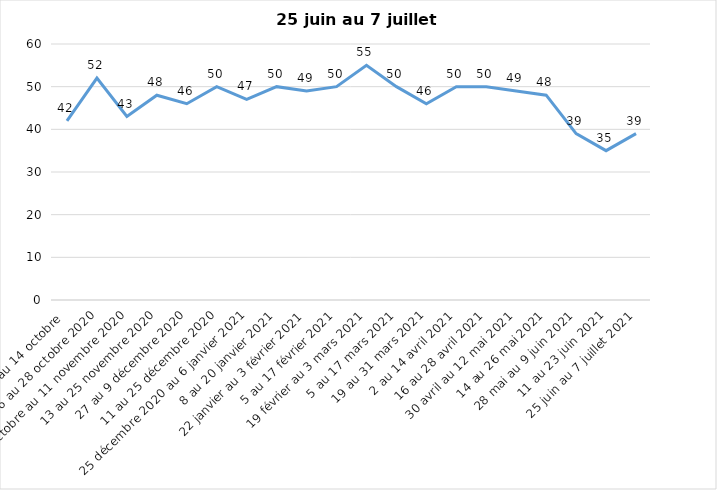
| Category | Toujours aux trois mesures |
|---|---|
| 2 au 14 octobre  | 42 |
| 16 au 28 octobre 2020 | 52 |
| 30 octobre au 11 novembre 2020 | 43 |
| 13 au 25 novembre 2020 | 48 |
| 27 au 9 décembre 2020 | 46 |
| 11 au 25 décembre 2020 | 50 |
| 25 décembre 2020 au 6 janvier 2021 | 47 |
| 8 au 20 janvier 2021 | 50 |
| 22 janvier au 3 février 2021 | 49 |
| 5 au 17 février 2021 | 50 |
| 19 février au 3 mars 2021 | 55 |
| 5 au 17 mars 2021 | 50 |
| 19 au 31 mars 2021 | 46 |
| 2 au 14 avril 2021 | 50 |
| 16 au 28 avril 2021 | 50 |
| 30 avril au 12 mai 2021 | 49 |
| 14 au 26 mai 2021 | 48 |
| 28 mai au 9 juin 2021 | 39 |
| 11 au 23 juin 2021 | 35 |
| 25 juin au 7 juillet 2021 | 39 |